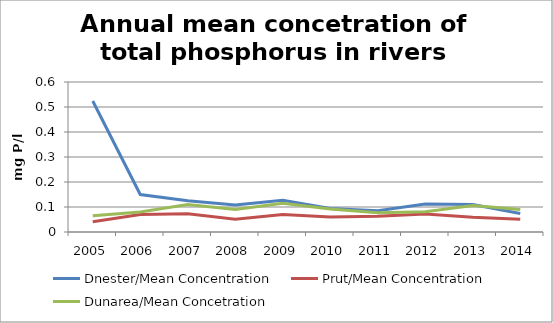
| Category | Dnester/Mean Concentration  | Prut/Mean Concentration | Dunarea/Mean Concetration |
|---|---|---|---|
| 2005.0 | 0.524 | 0.041 | 0.065 |
| 2006.0 | 0.15 | 0.07 | 0.08 |
| 2007.0 | 0.125 | 0.073 | 0.11 |
| 2008.0 | 0.108 | 0.051 | 0.09 |
| 2009.0 | 0.127 | 0.07 | 0.115 |
| 2010.0 | 0.094 | 0.06 | 0.092 |
| 2011.0 | 0.085 | 0.063 | 0.077 |
| 2012.0 | 0.112 | 0.072 | 0.081 |
| 2013.0 | 0.11 | 0.059 | 0.106 |
| 2014.0 | 0.074 | 0.051 | 0.09 |